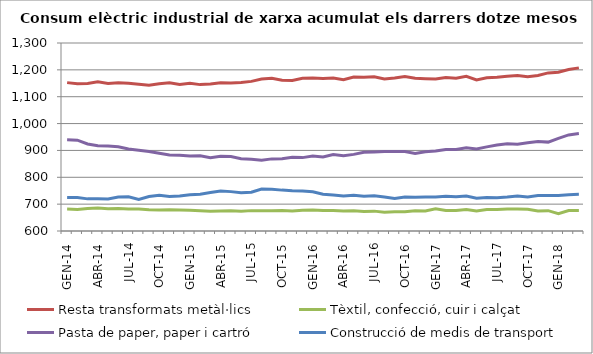
| Category | Resta transformats metàl·lics | Tèxtil, confecció, cuir i calçat | Pasta de paper, paper i cartró | Construcció de medis de transport |
|---|---|---|---|---|
| GEN-14 | 1152.496 | 681.805 | 939.57 | 725.074 |
| FEB-14 | 1147.985 | 680.364 | 938.039 | 724.302 |
| MAR-14 | 1149.22 | 683.913 | 923.908 | 719.651 |
| ABR-14 | 1155.223 | 685.324 | 917.208 | 720.248 |
| MAI-14 | 1149.446 | 683.247 | 916.205 | 719.146 |
| JUN-14 | 1152.354 | 683.42 | 913.877 | 726.485 |
| JUL-14 | 1150.347 | 681.473 | 905.633 | 727.763 |
| AGO-14 | 1146.663 | 681.654 | 900.912 | 717.762 |
| SET-14 | 1142.402 | 679.212 | 896.251 | 728.498 |
| OCT-14 | 1148.119 | 678.634 | 889.392 | 732.907 |
| NOV-14 | 1151.653 | 679.212 | 883.05 | 728.375 |
| DES-14 | 1145.736 | 678.374 | 882.013 | 730.239 |
| GEN-15 | 1149.987 | 677.129 | 879.306 | 735.359 |
| FEB-15 | 1145.049 | 675.543 | 880.385 | 737.13 |
| MAR-15 | 1147.217 | 673.909 | 873.214 | 743.374 |
| ABR-15 | 1151.663 | 674.075 | 878.036 | 748.867 |
| MAI-15 | 1150.862 | 674.933 | 877.295 | 746.607 |
| JUN-15 | 1153.067 | 673.632 | 869.298 | 742.538 |
| JUL-15 | 1157.141 | 675.864 | 866.815 | 744.417 |
| AGO-15 | 1166.014 | 675.861 | 863.358 | 756.557 |
| SET-15 | 1168.671 | 675.729 | 868.549 | 755.431 |
| OCT-15 | 1161.237 | 676.234 | 868.658 | 752.209 |
| NOV-15 | 1160.726 | 674.705 | 874.781 | 750.27 |
| DES-15 | 1168.696 | 677.314 | 873.235 | 749.227 |
| GEN-16 | 1169.892 | 678.621 | 878.818 | 746.193 |
| FEB-16 | 1168.139 | 676.67 | 875.395 | 736.585 |
| MAR-16 | 1169.651 | 676.183 | 884.508 | 734.45 |
| ABR-16 | 1163.332 | 674.453 | 880.643 | 730.75 |
| MAI-16 | 1173.475 | 675.258 | 885.31 | 733.064 |
| JUN-16 | 1172.348 | 672.365 | 893.557 | 729.842 |
| JUL-16 | 1174.4 | 673.988 | 894.468 | 730.819 |
| AGO-16 | 1166.166 | 669.908 | 895.655 | 726.653 |
| SET-16 | 1169.533 | 672.1 | 896.294 | 720.934 |
| OCT-16 | 1175.611 | 672.105 | 895.812 | 726.525 |
| NOV-16 | 1168.966 | 675.491 | 889.081 | 725.675 |
| DES-16 | 1167.294 | 674.628 | 894.75 | 726.835 |
| GEN-17 | 1166.104 | 682.83 | 897.56 | 726.786 |
| FEB-17 | 1171.765 | 676.538 | 903.399 | 729.11 |
| MAR-17 | 1168.692 | 676.42 | 903.094 | 727.109 |
| ABR-17 | 1176.152 | 679.686 | 909.962 | 730.115 |
| MAI-17 | 1162.431 | 674.686 | 905.808 | 721.781 |
| JUN-17 | 1170.39 | 679.597 | 913.202 | 725.14 |
| JUL-17 | 1172.681 | 679.903 | 920.081 | 724.175 |
| AGO-17 | 1176.144 | 681.869 | 924.706 | 726.356 |
| SET-17 | 1178.943 | 682.106 | 923.229 | 730.371 |
| OCT-17 | 1174.254 | 680.574 | 928.22 | 726.826 |
| NOV-17 | 1178.828 | 674.608 | 933.43 | 731.887 |
| DES-17 | 1188.689 | 675.789 | 930.966 | 732.112 |
| GEN-18 | 1191.182 | 664.48 | 945.073 | 732.078 |
| FEB-18 | 1201.157 | 676.468 | 957.847 | 735.415 |
| MAR-18 | 1207.354 | 676.467 | 962.78 | 736.786 |